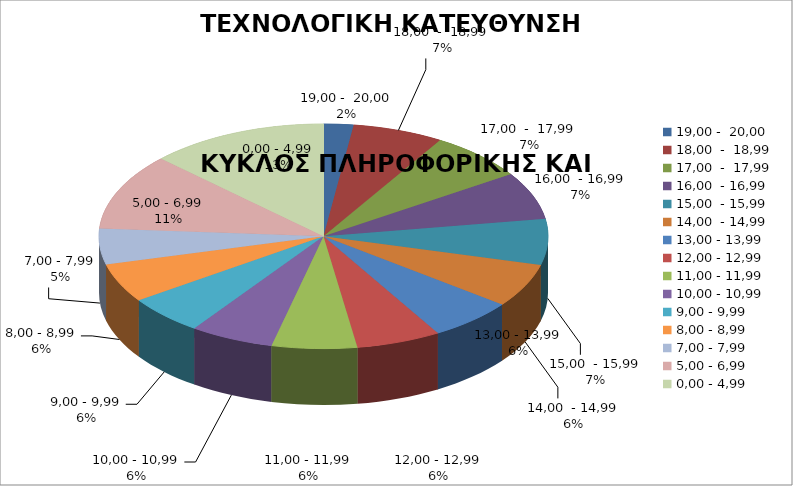
| Category | ΤΕΧΝΟΛΟΓΙΚΗ ΚΑΤΕΥΘΥΝΣΗ ΙΙ - 2010 |
|---|---|
| 19,00 -  20,00 | 2.147 |
| 18,00  -  18,99 | 6.531 |
| 17,00  -  17,99 | 6.994 |
| 16,00  - 16,99 | 6.834 |
| 15,00  - 15,99 | 6.593 |
| 14,00  - 14,99 | 6.271 |
| 13,00 - 13,99 | 6.139 |
| 12,00 - 12,99 | 6.08 |
| 11,00 - 11,99 | 6.127 |
| 10,00 - 10,99 | 6.03 |
| 9,00 - 9,99 | 5.611 |
| 8,00 - 8,99 | 5.604 |
| 7,00 - 7,99 | 5.128 |
| 5,00 - 6,99 | 11.046 |
| 0,00 - 4,99 | 12.864 |